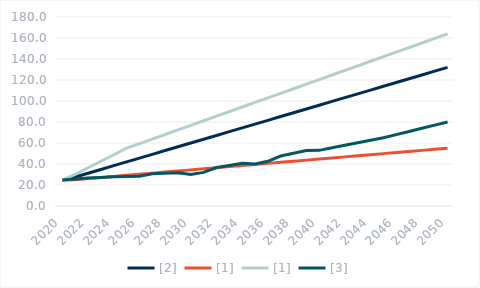
| Category | [2] | [1] | [3] |
|---|---|---|---|
| 2020.0 | 24.8 | 24.8 | 24.8 |
| 2021.0 | 27.6 | 30.208 | 25.6 |
| 2022.0 | 31.2 | 36.416 | 26.6 |
| 2023.0 | 34.8 | 42.624 | 27.2 |
| 2024.0 | 38.4 | 48.832 | 27.8 |
| 2025.0 | 42 | 55.04 | 28 |
| 2026.0 | 45.6 | 59.397 | 28.4 |
| 2027.0 | 49.2 | 63.755 | 30.8 |
| 2028.0 | 52.8 | 68.112 | 31.2 |
| 2029.0 | 56.4 | 72.469 | 31.6 |
| 2030.0 | 60 | 76.827 | 30 |
| 2031.0 | 63.6 | 81.184 | 32 |
| 2032.0 | 67.2 | 85.541 | 36.6 |
| 2033.0 | 70.8 | 89.899 | 38.6 |
| 2034.0 | 74.4 | 94.256 | 40.6 |
| 2035.0 | 78 | 98.613 | 40 |
| 2036.0 | 81.6 | 102.971 | 42.6 |
| 2037.0 | 85.2 | 107.328 | 47.6 |
| 2038.0 | 88.8 | 111.685 | 50.2 |
| 2039.0 | 92.4 | 116.043 | 52.8 |
| 2040.0 | 96 | 120.4 | 53 |
| 2041.0 | 99.6 | 124.757 | 55.4 |
| 2042.0 | 103.2 | 129.115 | 57.8 |
| 2043.0 | 106.8 | 133.472 | 60.2 |
| 2044.0 | 110.4 | 137.829 | 62.6 |
| 2045.0 | 114 | 142.187 | 65 |
| 2046.0 | 117.6 | 146.544 | 68 |
| 2047.0 | 121.2 | 150.901 | 71 |
| 2048.0 | 124.8 | 155.259 | 74 |
| 2049.0 | 128.4 | 159.616 | 77 |
| 2050.0 | 132 | 163.973 | 80 |